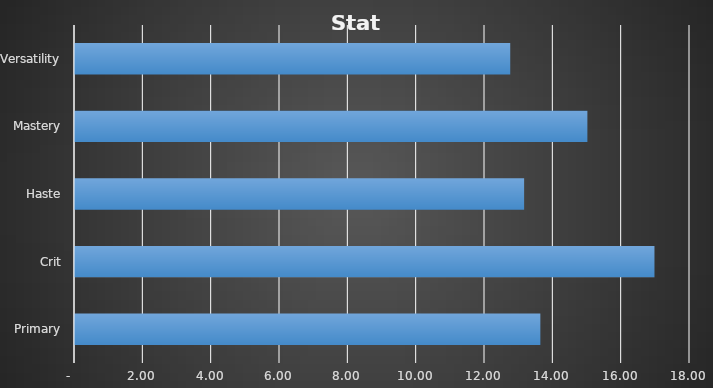
| Category | Series 0 |
|---|---|
| Primary | 13.62 |
| Crit | 16.96 |
| Haste | 13.145 |
| Mastery | 14.997 |
| Versatility | 12.738 |